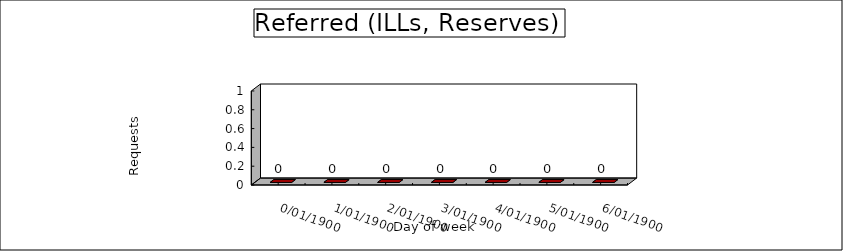
| Category | Referred (RSV, ILL, etc) |
|---|---|
| 0 | 0 |
| 1900-01-01 | 0 |
| 1900-01-02 | 0 |
| 1900-01-03 | 0 |
| 1900-01-04 | 0 |
| 1900-01-05 | 0 |
| 1900-01-06 | 0 |